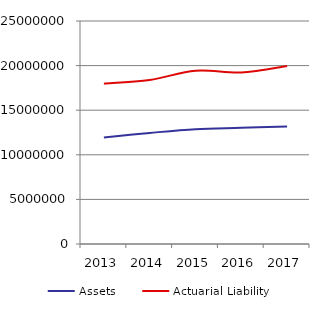
| Category |  Assets  |  Actuarial Liability  |
|---|---|---|
| 2013.0 | 11943638 | 17972554 |
| 2014.0 | 12452833 | 18385752 |
| 2015.0 | 12878070 | 19426480 |
| 2016.0 | 13025500 | 19235619 |
| 2017.0 | 13174974 | 19957277 |